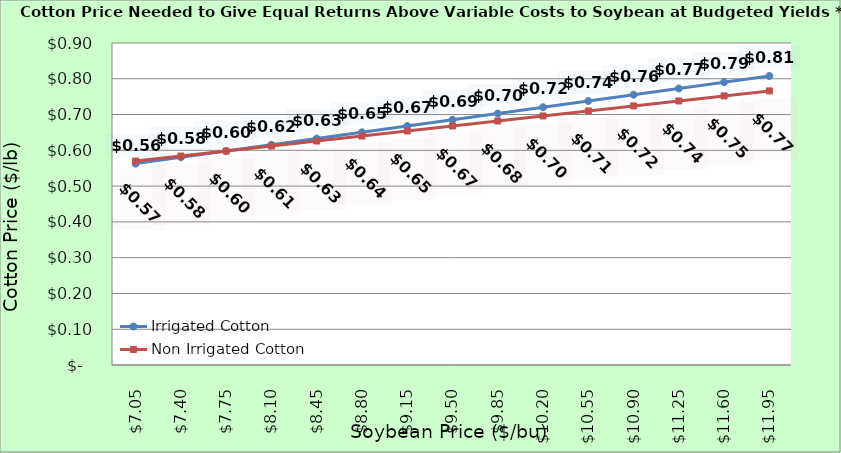
| Category | Irrigated Cotton | Non Irrigated Cotton |
|---|---|---|
| 7.0500000000000025 | 0.563 | 0.57 |
| 7.400000000000002 | 0.58 | 0.584 |
| 7.750000000000002 | 0.598 | 0.598 |
| 8.100000000000001 | 0.615 | 0.612 |
| 8.450000000000001 | 0.633 | 0.626 |
| 8.8 | 0.65 | 0.64 |
| 9.15 | 0.668 | 0.654 |
| 9.5 | 0.685 | 0.668 |
| 9.85 | 0.703 | 0.682 |
| 10.2 | 0.72 | 0.696 |
| 10.549999999999999 | 0.738 | 0.71 |
| 10.899999999999999 | 0.755 | 0.724 |
| 11.249999999999998 | 0.773 | 0.738 |
| 11.599999999999998 | 0.79 | 0.752 |
| 11.949999999999998 | 0.808 | 0.766 |